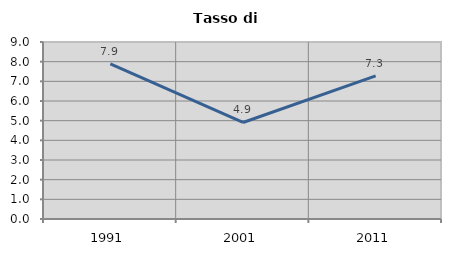
| Category | Tasso di disoccupazione   |
|---|---|
| 1991.0 | 7.885 |
| 2001.0 | 4.907 |
| 2011.0 | 7.279 |